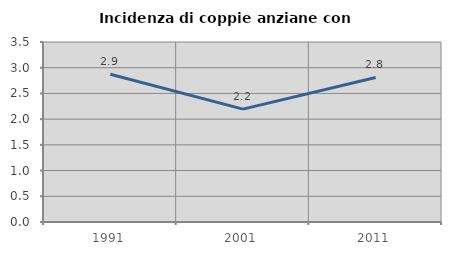
| Category | Incidenza di coppie anziane con figli |
|---|---|
| 1991.0 | 2.874 |
| 2001.0 | 2.195 |
| 2011.0 | 2.81 |